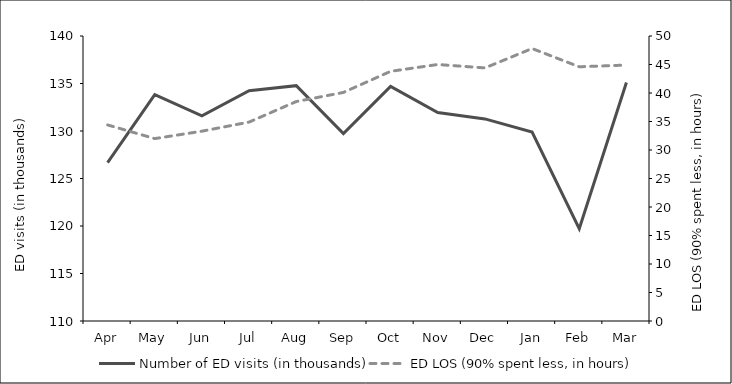
| Category | Number of ED visits (in thousands) |
|---|---|
| Apr | 126.672 |
| May | 133.837 |
| Jun | 131.588 |
| Jul | 134.235 |
| Aug | 134.771 |
| Sep | 129.726 |
| Oct | 134.702 |
| Nov | 131.937 |
| Dec | 131.274 |
| Jan | 129.881 |
| Feb | 119.713 |
| Mar | 135.103 |